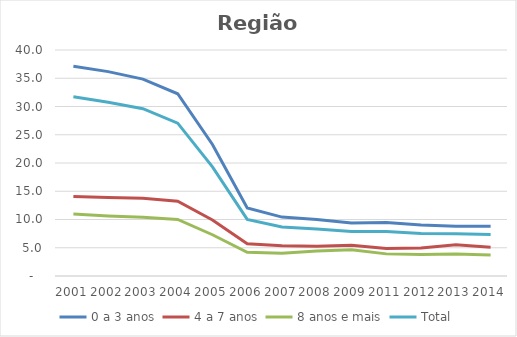
| Category | 0 a 3 anos | 4 a 7 anos | 8 anos e mais | Total |
|---|---|---|---|---|
| 2001.0 | 37.109 | 14.06 | 10.956 | 31.737 |
| 2002.0 | 36.174 | 13.882 | 10.629 | 30.744 |
| 2003.0 | 34.85 | 13.74 | 10.383 | 29.614 |
| 2004.0 | 32.253 | 13.223 | 10.007 | 27.048 |
| 2005.0 | 23.281 | 9.916 | 7.304 | 19.326 |
| 2006.0 | 12.035 | 5.701 | 4.186 | 10.018 |
| 2007.0 | 10.428 | 5.359 | 4.018 | 8.68 |
| 2008.0 | 10.02 | 5.256 | 4.435 | 8.319 |
| 2009.0 | 9.399 | 5.422 | 4.645 | 7.897 |
| 2011.0 | 9.457 | 4.849 | 3.916 | 7.875 |
| 2012.0 | 9.005 | 4.943 | 3.786 | 7.537 |
| 2013.0 | 8.796 | 5.535 | 3.899 | 7.498 |
| 2014.0 | 8.805 | 5.107 | 3.72 | 7.348 |